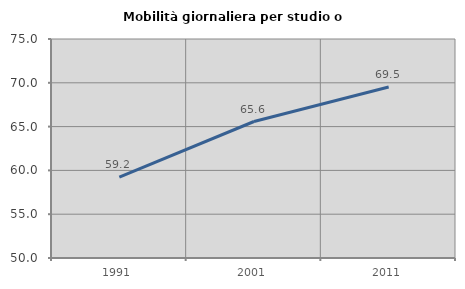
| Category | Mobilità giornaliera per studio o lavoro |
|---|---|
| 1991.0 | 59.232 |
| 2001.0 | 65.582 |
| 2011.0 | 69.514 |